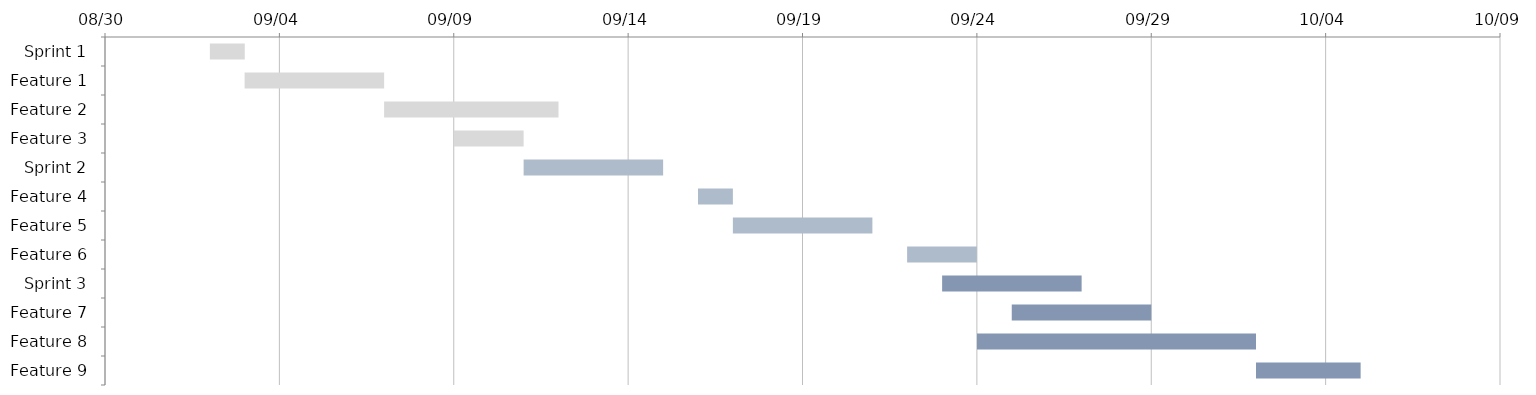
| Category | START | DAYS |
|---|---|---|
| Sprint 1 | 2022-09-02 | 1 |
| Feature 1 | 2022-09-03 | 4 |
| Feature 2 | 2022-09-07 | 5 |
| Feature 3 | 2022-09-09 | 2 |
| Sprint 2 | 2022-09-11 | 4 |
| Feature 4 | 2022-09-16 | 1 |
| Feature 5 | 2022-09-17 | 4 |
| Feature 6 | 2022-09-22 | 2 |
| Sprint 3 | 2022-09-23 | 4 |
| Feature 7 | 2022-09-25 | 4 |
| Feature 8 | 2022-09-24 | 8 |
| Feature 9 | 2022-10-02 | 3 |